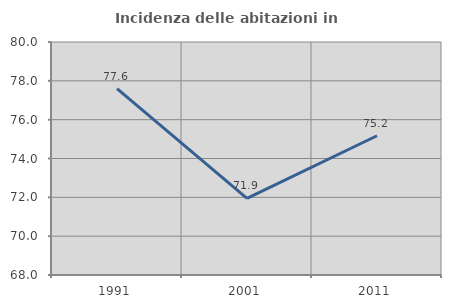
| Category | Incidenza delle abitazioni in proprietà  |
|---|---|
| 1991.0 | 77.6 |
| 2001.0 | 71.942 |
| 2011.0 | 75.172 |